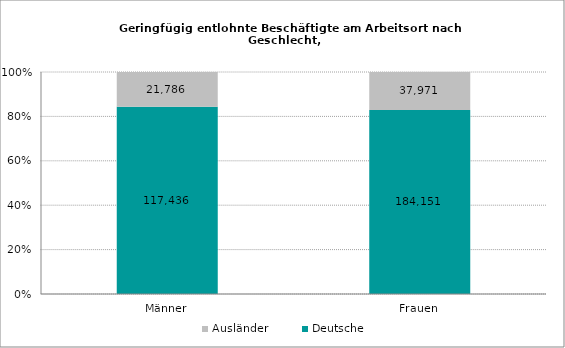
| Category | Deutsche | Ausländer |
|---|---|---|
| Männer | 117436 | 21786 |
| Frauen | 184151 | 37971 |